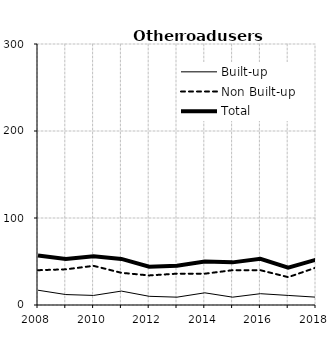
| Category | Built-up | Non Built-up | Total |
|---|---|---|---|
| 2008.0 | 17 | 40 | 57 |
| 2009.0 | 12 | 41 | 53 |
| 2010.0 | 11 | 45 | 56 |
| 2011.0 | 16 | 37 | 53 |
| 2012.0 | 10 | 34 | 44 |
| 2013.0 | 9 | 36 | 45 |
| 2014.0 | 14 | 36 | 50 |
| 2015.0 | 9 | 40 | 49 |
| 2016.0 | 13 | 40 | 53 |
| 2017.0 | 11 | 32 | 43 |
| 2018.0 | 9 | 43 | 52 |